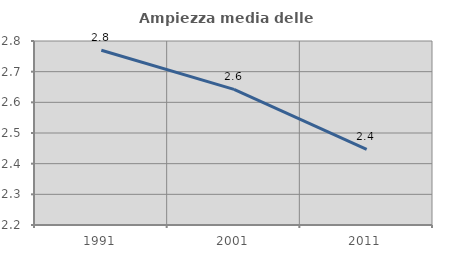
| Category | Ampiezza media delle famiglie |
|---|---|
| 1991.0 | 2.77 |
| 2001.0 | 2.642 |
| 2011.0 | 2.446 |